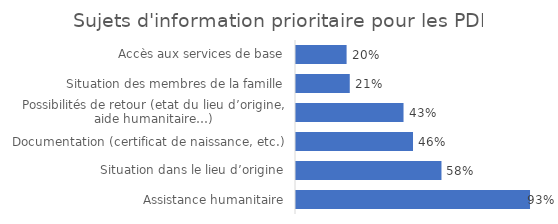
| Category | Fréquence |
|---|---|
| Assistance humanitaire | 0.925 |
| Situation dans le lieu d’origine | 0.575 |
| Documentation (certificat de naissance, etc.) | 0.462 |
| Possibilités de retour (etat du lieu d’origine, aide humanitaire…) | 0.425 |
| Situation des membres de la famille | 0.212 |
| Accès aux services de base | 0.2 |